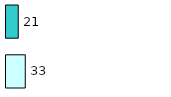
| Category | Series 0 | Series 1 |
|---|---|---|
| 0 | 33 | 21 |